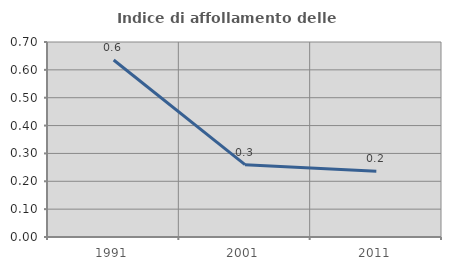
| Category | Indice di affollamento delle abitazioni  |
|---|---|
| 1991.0 | 0.635 |
| 2001.0 | 0.26 |
| 2011.0 | 0.236 |